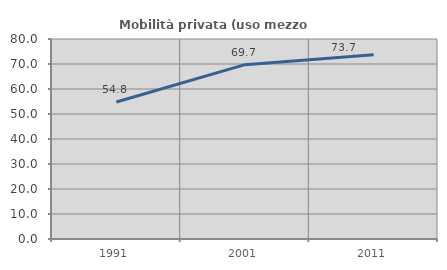
| Category | Mobilità privata (uso mezzo privato) |
|---|---|
| 1991.0 | 54.807 |
| 2001.0 | 69.73 |
| 2011.0 | 73.652 |